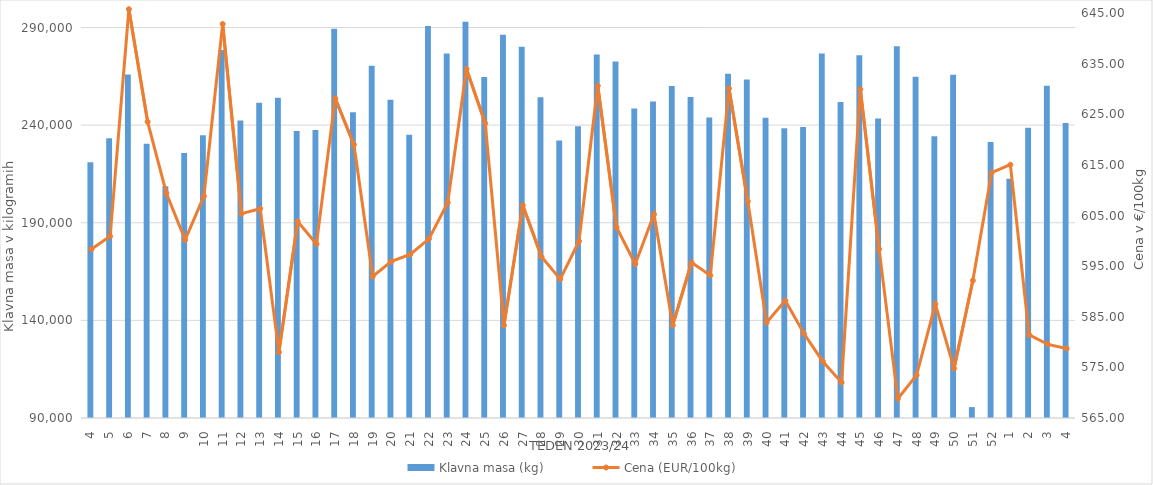
| Category | Klavna masa (kg) |
|---|---|
| 4.0 | 221002 |
| 5.0 | 233306 |
| 6.0 | 265944 |
| 7.0 | 230531 |
| 8.0 | 208699 |
| 9.0 | 225712 |
| 10.0 | 234762 |
| 11.0 | 278467 |
| 12.0 | 242369 |
| 13.0 | 251507 |
| 14.0 | 254072 |
| 15.0 | 236964 |
| 16.0 | 237552 |
| 17.0 | 289400 |
| 18.0 | 246616 |
| 19.0 | 270374 |
| 20.0 | 252984 |
| 21.0 | 235060 |
| 22.0 | 290816 |
| 23.0 | 276702 |
| 24.0 | 292976 |
| 25.0 | 264669 |
| 26.0 | 286237 |
| 27.0 | 280112 |
| 28.0 | 254336 |
| 29.0 | 232178 |
| 30.0 | 239437 |
| 31.0 | 276163 |
| 32.0 | 272647 |
| 33.0 | 248536 |
| 34.0 | 252050 |
| 35.0 | 260110 |
| 36.0 | 254389 |
| 37.0 | 243933 |
| 38.0 | 266321 |
| 39.0 | 263346 |
| 40.0 | 243765 |
| 41.0 | 238404 |
| 42.0 | 239007 |
| 43.0 | 276684 |
| 44.0 | 251832 |
| 45.0 | 275816 |
| 46.0 | 243425 |
| 47.0 | 280350 |
| 48.0 | 264849 |
| 49.0 | 234308 |
| 50.0 | 265786 |
| 51.0 | 95590 |
| 52.0 | 231370 |
| 1.0 | 212581 |
| 2.0 | 238607 |
| 3.0 | 260140 |
| 4.0 | 241148 |